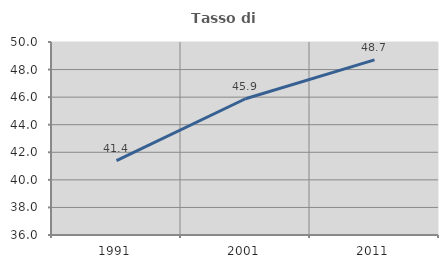
| Category | Tasso di occupazione   |
|---|---|
| 1991.0 | 41.391 |
| 2001.0 | 45.884 |
| 2011.0 | 48.699 |